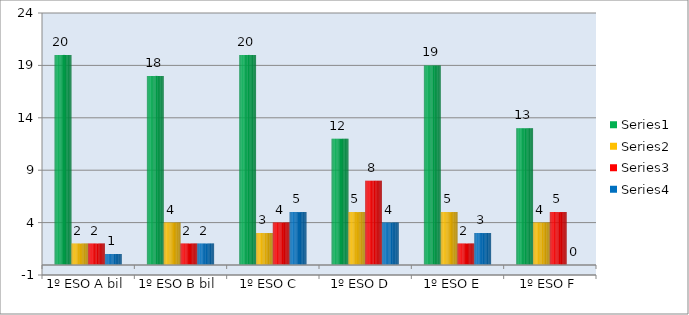
| Category | Series 1 | Series 2 | Series 3 | Series 4 |
|---|---|---|---|---|
| 1º ESO A bil | 20 | 2 | 2 | 1 |
| 1º ESO B bil | 18 | 4 | 2 | 2 |
| 1º ESO C  | 20 | 3 | 4 | 5 |
| 1º ESO D  | 12 | 5 | 8 | 4 |
| 1º ESO E  | 19 | 5 | 2 | 3 |
| 1º ESO F | 13 | 4 | 5 | 0 |